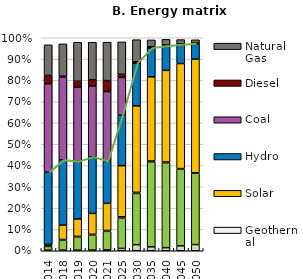
| Category | Other renewables | Wind | Geothermal | Solar | Hydro | Coal | Diesel | Natural Gas |
|---|---|---|---|---|---|---|---|---|
| 2014.0 | 0.003 | 0.018 | 0.003 | 0.007 | 0.339 | 0.415 | 0.039 | 0.143 |
| 2018.0 | 0.003 | 0.047 | 0.003 | 0.068 | 0.306 | 0.389 | 0.004 | 0.151 |
| 2019.0 | 0.003 | 0.062 | 0.003 | 0.082 | 0.27 | 0.349 | 0.028 | 0.183 |
| 2020.0 | 0.003 | 0.071 | 0.003 | 0.098 | 0.266 | 0.332 | 0.029 | 0.177 |
| 2021.0 | 0.004 | 0.087 | 0.004 | 0.127 | 0.199 | 0.326 | 0.052 | 0.18 |
| 2025.0 | 0.011 | 0.142 | 0.007 | 0.24 | 0.237 | 0.177 | 0.015 | 0.152 |
| 2030.0 | 0.029 | 0.24 | 0.005 | 0.406 | 0.201 | 0 | 0.006 | 0.104 |
| 2035.0 | 0.018 | 0.399 | 0.004 | 0.395 | 0.136 | 0 | 0.005 | 0.032 |
| 2040.0 | 0.014 | 0.399 | 0.003 | 0.43 | 0.115 | 0 | 0.004 | 0.027 |
| 2045.0 | 0.023 | 0.36 | 0.002 | 0.493 | 0.089 | 0 | 0.003 | 0.02 |
| 2050.0 | 0.029 | 0.335 | 0.002 | 0.534 | 0.073 | 0 | 0.002 | 0.015 |